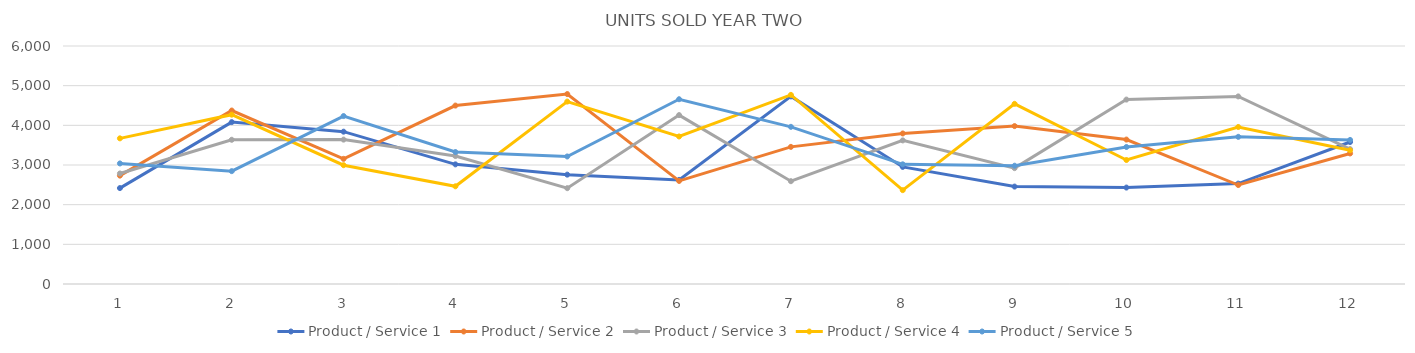
| Category | Product / Service 1 | Product / Service 2 | Product / Service 3 | Product / Service 4 | Product / Service 5 |
|---|---|---|---|---|---|
| 0 | 2418 | 2732 | 2786 | 3672 | 3039 |
| 1 | 4081 | 4373 | 3636 | 4269 | 2845 |
| 2 | 3840 | 3155 | 3640 | 2995 | 4234 |
| 3 | 3016 | 4498 | 3226 | 2463 | 3327 |
| 4 | 2757 | 4788 | 2416 | 4599 | 3215 |
| 5 | 2625 | 2598 | 4258 | 3719 | 4658 |
| 6 | 4729 | 3457 | 2592 | 4768 | 3962 |
| 7 | 2952 | 3795 | 3620 | 2366 | 3017 |
| 8 | 2456 | 3981 | 2921 | 4542 | 2982 |
| 9 | 2431 | 3641 | 4649 | 3126 | 3454 |
| 10 | 2531 | 2495 | 4729 | 3958 | 3710 |
| 11 | 3580 | 3291 | 3400 | 3372 | 3632 |